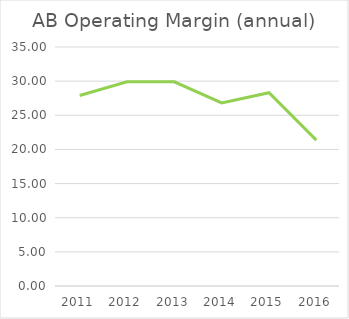
| Category | Series 0 |
|---|---|
| 2011.0 | 27.9 |
| 2012.0 | 29.9 |
| 2013.0 | 29.9 |
| 2014.0 | 26.8 |
| 2015.0 | 28.3 |
| 2016.0 | 21.36 |